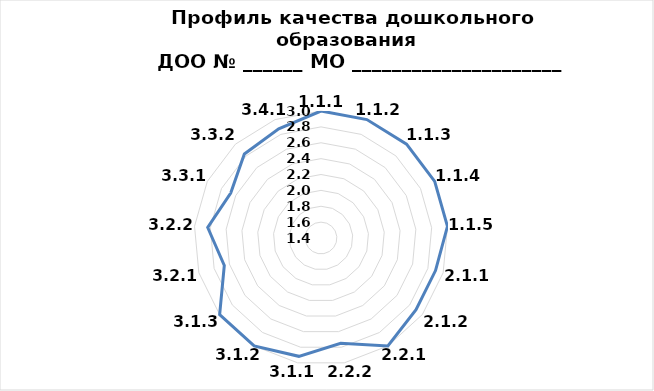
| Category | Series 0 |
|---|---|
| 1.1.1 | 3 |
| 1.1.2 | 3 |
| 1.1.3 | 3 |
| 1.1.4 | 3 |
| 1.1.5 | 3 |
| 2.1.1 | 2.9 |
| 2.1.2 | 2.9 |
| 2.2.1 | 3 |
| 2.2.2 | 2.75 |
| 3.1.1 | 2.917 |
| 3.1.2 | 3 |
| 3.1.3 | 3 |
| 3.2.1 | 2.667 |
| 3.2.2 | 2.833 |
| 3.3.1 | 2.671 |
| 3.3.2 | 2.833 |
| 3.4.1 | 2.875 |